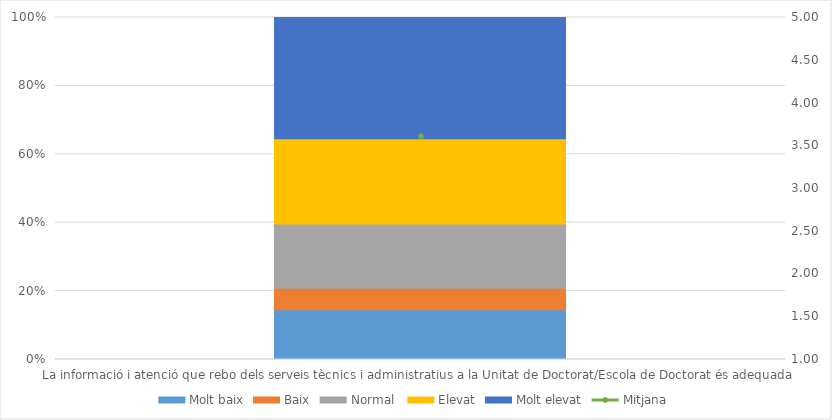
| Category | Molt baix | Baix | Normal  | Elevat | Molt elevat |
|---|---|---|---|---|---|
| La informació i atenció que rebo dels serveis tècnics i administratius a la Unitat de Doctorat/Escola de Doctorat és adequada | 7 | 3 | 9 | 12 | 17 |